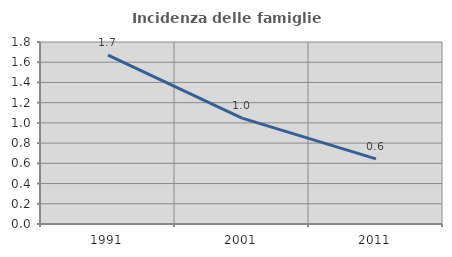
| Category | Incidenza delle famiglie numerose |
|---|---|
| 1991.0 | 1.671 |
| 2001.0 | 1.048 |
| 2011.0 | 0.645 |